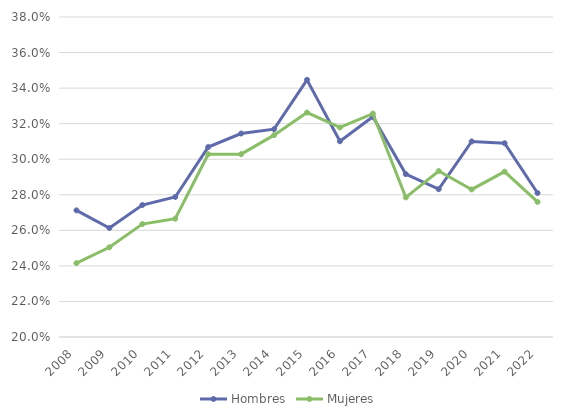
| Category | Hombres | Mujeres |
|---|---|---|
| 2008.0 | 0.271 | 0.242 |
| 2009.0 | 0.261 | 0.25 |
| 2010.0 | 0.274 | 0.264 |
| 2011.0 | 0.279 | 0.267 |
| 2012.0 | 0.307 | 0.303 |
| 2013.0 | 0.314 | 0.303 |
| 2014.0 | 0.317 | 0.314 |
| 2015.0 | 0.345 | 0.326 |
| 2016.0 | 0.31 | 0.318 |
| 2017.0 | 0.324 | 0.326 |
| 2018.0 | 0.292 | 0.279 |
| 2019.0 | 0.283 | 0.293 |
| 2020.0 | 0.31 | 0.283 |
| 2021.0 | 0.309 | 0.293 |
| 2022.0 | 0.281 | 0.276 |